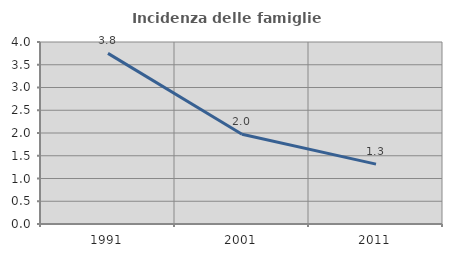
| Category | Incidenza delle famiglie numerose |
|---|---|
| 1991.0 | 3.75 |
| 2001.0 | 1.974 |
| 2011.0 | 1.316 |